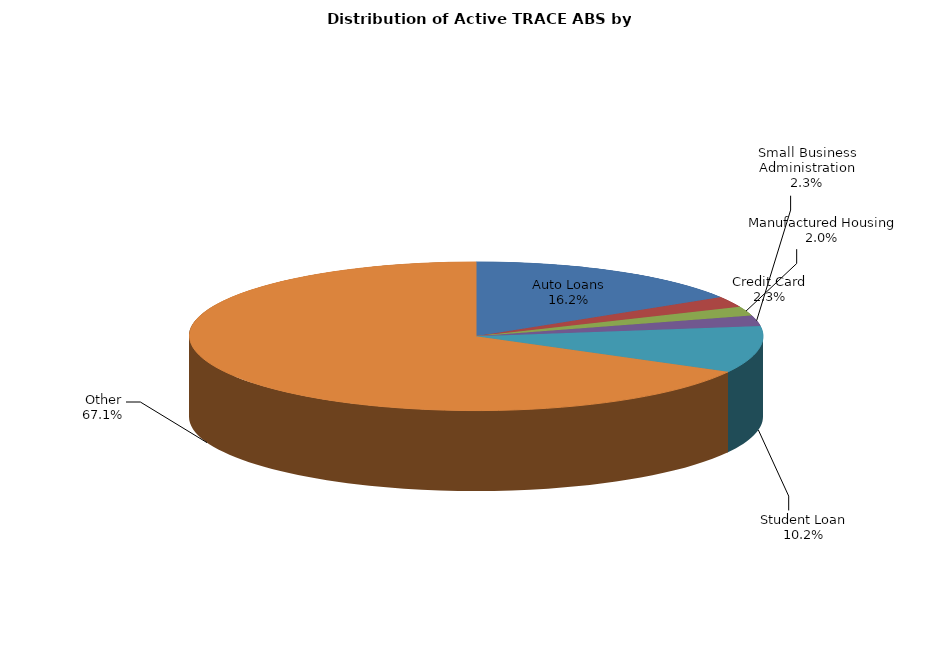
| Category | Series 0 |
|---|---|
| Auto Loans | 2245 |
| Credit Card | 322 |
| Manufactured Housing | 276 |
| Small Business Administration | 318 |
| Student Loan | 1410 |
| Other | 9304 |